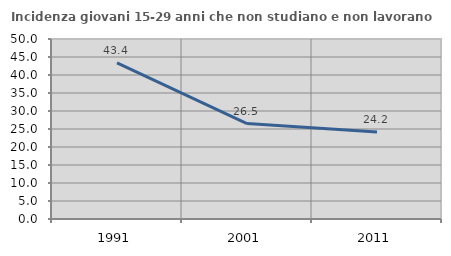
| Category | Incidenza giovani 15-29 anni che non studiano e non lavorano  |
|---|---|
| 1991.0 | 43.373 |
| 2001.0 | 26.506 |
| 2011.0 | 24.167 |